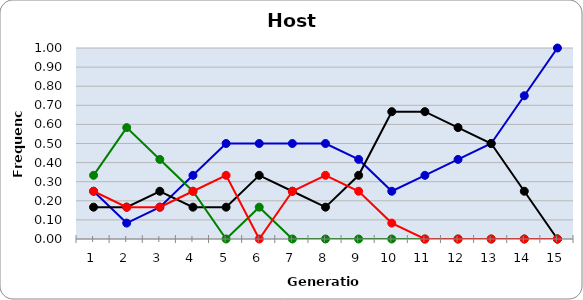
| Category | Sp | Cl | Di | He |
|---|---|---|---|---|
| 1.0 | 0.25 | 0.167 | 0.333 | 0.25 |
| 2.0 | 0.083 | 0.167 | 0.583 | 0.167 |
| 3.0 | 0.167 | 0.25 | 0.417 | 0.167 |
| 4.0 | 0.333 | 0.167 | 0.25 | 0.25 |
| 5.0 | 0.5 | 0.167 | 0 | 0.333 |
| 6.0 | 0.5 | 0.333 | 0.167 | 0 |
| 7.0 | 0.5 | 0.25 | 0 | 0.25 |
| 8.0 | 0.5 | 0.167 | 0 | 0.333 |
| 9.0 | 0.417 | 0.333 | 0 | 0.25 |
| 10.0 | 0.25 | 0.667 | 0 | 0.083 |
| 11.0 | 0.333 | 0.667 | 0 | 0 |
| 12.0 | 0.417 | 0.583 | 0 | 0 |
| 13.0 | 0.5 | 0.5 | 0 | 0 |
| 14.0 | 0.75 | 0.25 | 0 | 0 |
| 15.0 | 1 | 0 | 0 | 0 |